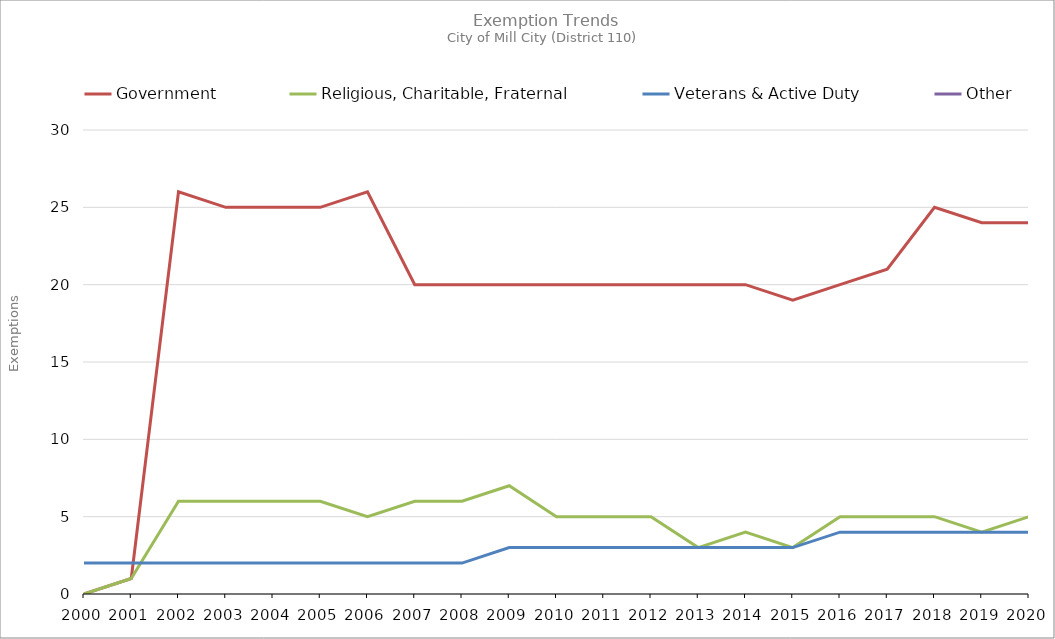
| Category | Government | Religious, Charitable, Fraternal | Veterans & Active Duty | Other |
|---|---|---|---|---|
| 2000.0 | 0 | 0 | 2 |  |
| 2001.0 | 1 | 1 | 2 |  |
| 2002.0 | 26 | 6 | 2 |  |
| 2003.0 | 25 | 6 | 2 |  |
| 2004.0 | 25 | 6 | 2 |  |
| 2005.0 | 25 | 6 | 2 |  |
| 2006.0 | 26 | 5 | 2 |  |
| 2007.0 | 20 | 6 | 2 |  |
| 2008.0 | 20 | 6 | 2 |  |
| 2009.0 | 20 | 7 | 3 |  |
| 2010.0 | 20 | 5 | 3 |  |
| 2011.0 | 20 | 5 | 3 |  |
| 2012.0 | 20 | 5 | 3 |  |
| 2013.0 | 20 | 3 | 3 |  |
| 2014.0 | 20 | 4 | 3 |  |
| 2015.0 | 19 | 3 | 3 |  |
| 2016.0 | 20 | 5 | 4 |  |
| 2017.0 | 21 | 5 | 4 |  |
| 2018.0 | 25 | 5 | 4 |  |
| 2019.0 | 24 | 4 | 4 |  |
| 2020.0 | 24 | 5 | 4 |  |